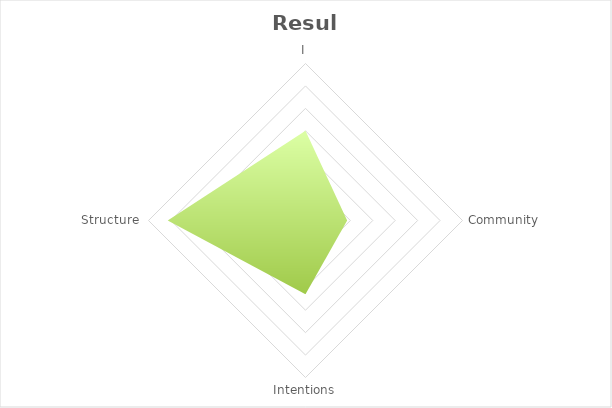
| Category | Series 0 |
|---|---|
| I | 3 |
| Community | 2.786 |
| Intentions | 2.929 |
| Structure | 3.214 |